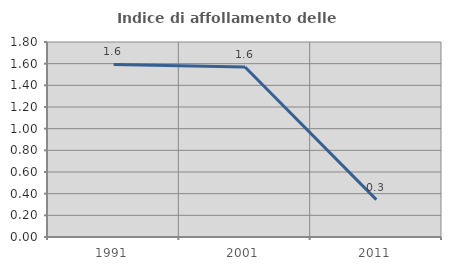
| Category | Indice di affollamento delle abitazioni  |
|---|---|
| 1991.0 | 1.592 |
| 2001.0 | 1.57 |
| 2011.0 | 0.345 |